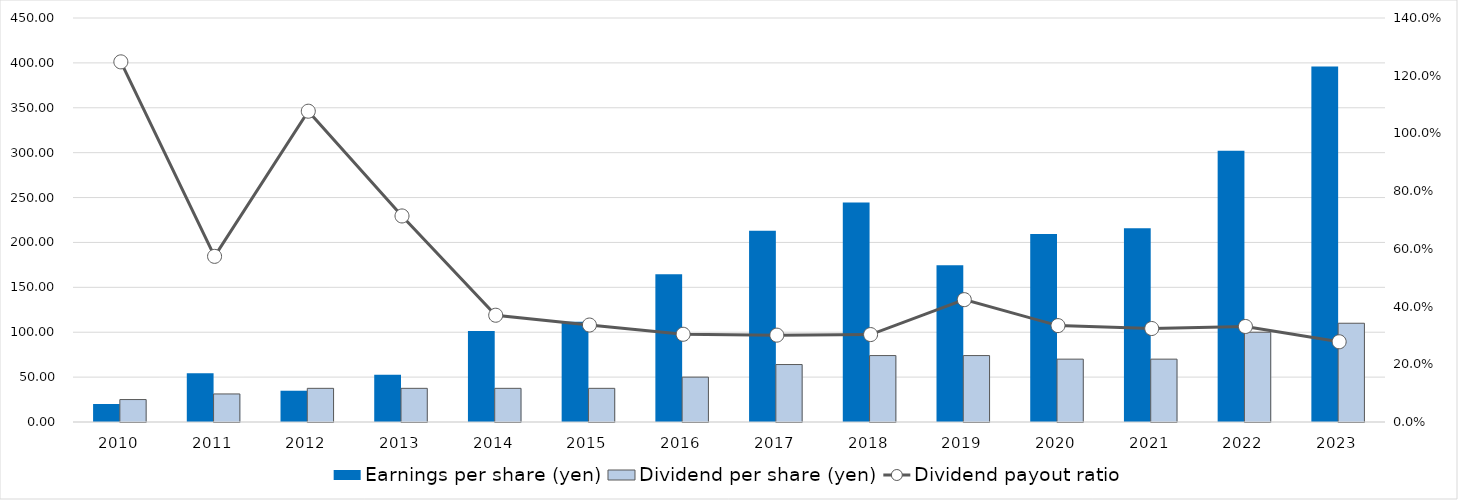
| Category | Earnings per share (yen) | Dividend per share (yen) |
|---|---|---|
| 2010 | 20.035 | 25 |
| 2011 | 54.412 | 31.25 |
| 2012 | 34.83 | 37.5 |
| 2013 | 52.535 | 37.5 |
| 2014 | 101.463 | 37.5 |
| 2015 | 111.698 | 37.5 |
| 2016 | 164.674 | 50 |
| 2017 | 212.958 | 64 |
| 2018 | 244.599 | 74 |
| 2019 | 174.552 | 74 |
| 2020 | 209.321 | 70 |
| 2021 | 215.83 | 70 |
| 2022 | 302.18 | 100 |
| 2023 | 396.096 | 110 |